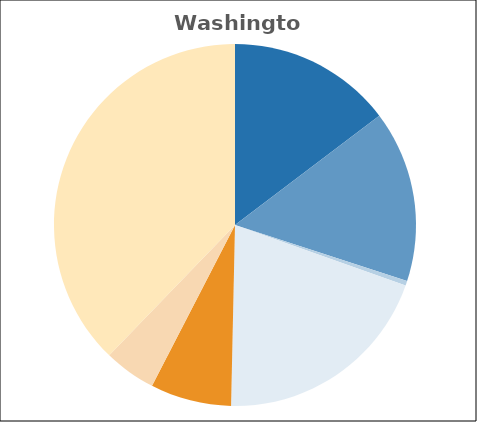
| Category | Series 0 |
|---|---|
| Basic Assistance | 0.147 |
| Work Activities | 0.153 |
| Work Supports and Supportive Services | 0.004 |
| Child Care | 0.199 |
| Administration & Systems | 0.072 |
| Tax Credit | 0 |
| Pre-K | 0.046 |
| Child Welfare | 0 |
| Other | 0.378 |